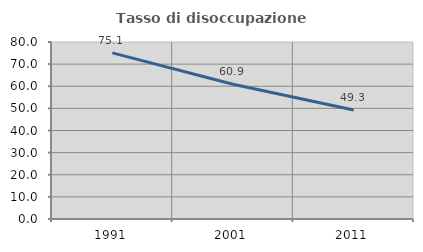
| Category | Tasso di disoccupazione giovanile  |
|---|---|
| 1991.0 | 75.069 |
| 2001.0 | 60.87 |
| 2011.0 | 49.286 |